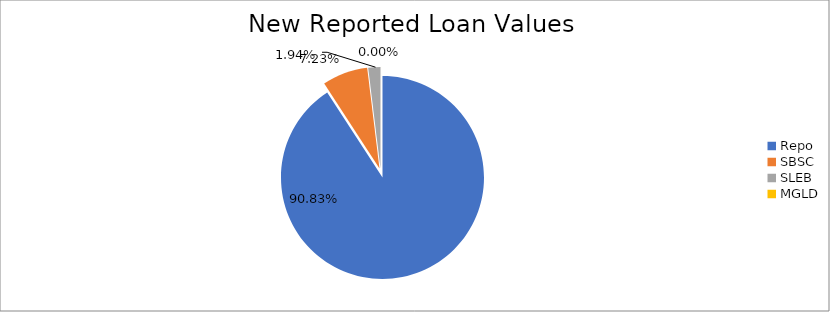
| Category | Series 0 |
|---|---|
| Repo | 9019126.831 |
| SBSC | 718261.14 |
| SLEB | 192223.834 |
| MGLD | 130.838 |